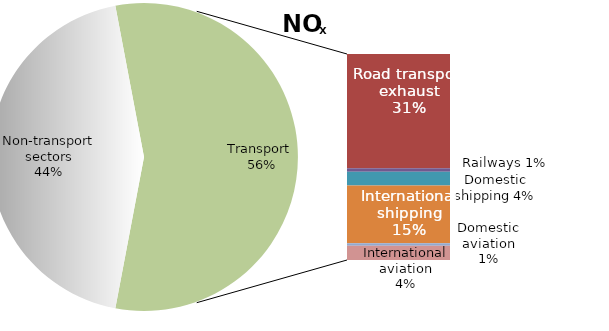
| Category | Series 0 |
|---|---|
| Non-transport sectors | 5731.777 |
| Road transport exhaust | 4039.911 |
| Road transport non-exhaust | 0 |
| Railways | 122.962 |
| Domestic shipping | 486.611 |
| International shipping | 2038.813 |
| Domestic aviation | 89.202 |
| International aviation | 507.453 |